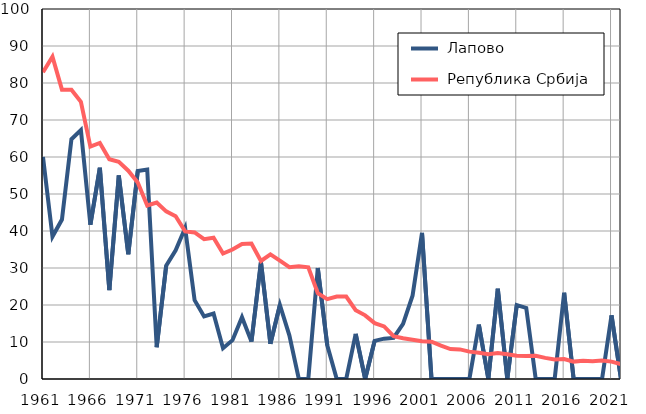
| Category |  Лапово |  Република Србија |
|---|---|---|
| 1961.0 | 60 | 82.9 |
| 1962.0 | 38.5 | 87.1 |
| 1963.0 | 43.1 | 78.2 |
| 1964.0 | 64.8 | 78.2 |
| 1965.0 | 67.3 | 74.9 |
| 1966.0 | 41.7 | 62.8 |
| 1967.0 | 57.1 | 63.8 |
| 1968.0 | 24 | 59.4 |
| 1969.0 | 55 | 58.7 |
| 1970.0 | 33.7 | 56.3 |
| 1971.0 | 56.2 | 53.1 |
| 1972.0 | 56.6 | 46.9 |
| 1973.0 | 8.6 | 47.7 |
| 1974.0 | 30.6 | 45.3 |
| 1975.0 | 34.8 | 44 |
| 1976.0 | 40.8 | 39.9 |
| 1977.0 | 21.3 | 39.6 |
| 1978.0 | 16.9 | 37.8 |
| 1979.0 | 17.7 | 38.2 |
| 1980.0 | 8.3 | 33.9 |
| 1981.0 | 10.5 | 35 |
| 1982.0 | 16.7 | 36.5 |
| 1983.0 | 10.1 | 36.6 |
| 1984.0 | 31.6 | 31.9 |
| 1985.0 | 9.5 | 33.7 |
| 1986.0 | 20 | 32 |
| 1987.0 | 11.8 | 30.2 |
| 1988.0 | 0 | 30.5 |
| 1989.0 | 0 | 30.2 |
| 1990.0 | 30 | 23.2 |
| 1991.0 | 9.1 | 21.6 |
| 1992.0 | 0 | 22.3 |
| 1993.0 | 0 | 22.3 |
| 1994.0 | 12.2 | 18.6 |
| 1995.0 | 0 | 17.2 |
| 1996.0 | 10.3 | 15.1 |
| 1997.0 | 10.9 | 14.2 |
| 1998.0 | 11.1 | 11.6 |
| 1999.0 | 14.9 | 11 |
| 2000.0 | 22.5 | 10.6 |
| 2001.0 | 39.5 | 10.2 |
| 2002.0 | 0 | 10.1 |
| 2003.0 | 0 | 9 |
| 2004.0 | 0 | 8.1 |
| 2005.0 | 0 | 8 |
| 2006.0 | 0 | 7.4 |
| 2007.0 | 14.7 | 7.1 |
| 2008.0 | 0 | 6.7 |
| 2009.0 | 24.4 | 7 |
| 2010.0 | 0 | 6.7 |
| 2011.0 | 20 | 6.3 |
| 2012.0 | 19.2 | 6.2 |
| 2013.0 | 0 | 6.3 |
| 2014.0 | 0 | 5.7 |
| 2015.0 | 0 | 5.3 |
| 2016.0 | 23.3 | 5.4 |
| 2017.0 | 0 | 4.7 |
| 2018.0 | 0 | 4.9 |
| 2019.0 | 0 | 4.8 |
| 2020.0 | 0 | 5 |
| 2021.0 | 17.2 | 4.7 |
| 2022.0 | 0 | 4 |